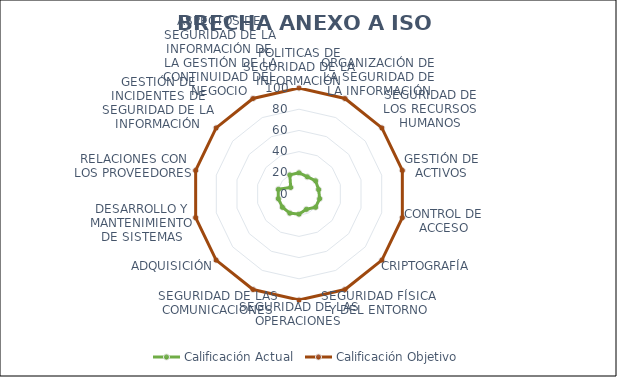
| Category | Calificación Actual | Calificación Objetivo |
|---|---|---|
| 0 | 20 | 100 |
| 1 | 18 | 100 |
| 2 | 20 | 100 |
| 3 | 19 | 100 |
| 4 | 20 | 100 |
| 5 | 20 | 100 |
| 6 | 16 | 100 |
| 7 | 19 | 100 |
| 8 | 20 | 100 |
| 9 | 20 | 100 |
| 10 | 20 | 100 |
| 11 | 20 | 100 |
| 12 | 10 | 100 |
| 13 | 20 | 100 |